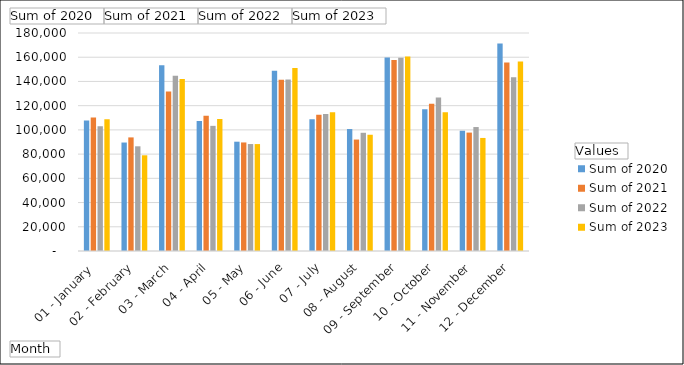
| Category | Sum of 2020 | Sum of 2021 | Sum of 2022 | Sum of 2023 |
|---|---|---|---|---|
| 01 - January  | 107663 | 110257 | 103008 | 108771 |
| 02 - February | 89566 | 93794 | 86453 | 79020 |
| 03 - March | 153411 | 131646 | 144688 | 142090 |
| 04 - April | 107266 | 111621 | 103334 | 109047 |
| 05 - May | 90254 | 89626 | 88323 | 88275 |
| 06 - June | 148813 | 141446 | 141628 | 151057 |
| 07 - July | 108808 | 112455 | 113149 | 114655 |
| 08 - August | 100707 | 92023 | 97613 | 95985 |
| 09 - September | 159689 | 157652 | 159526 | 160582 |
| 10 - October | 116967 | 121626 | 126817 | 114560 |
| 11 - November | 99284 | 97766 | 102357 | 93348 |
| 12 - December | 171332 | 155551 | 143565 | 156411 |